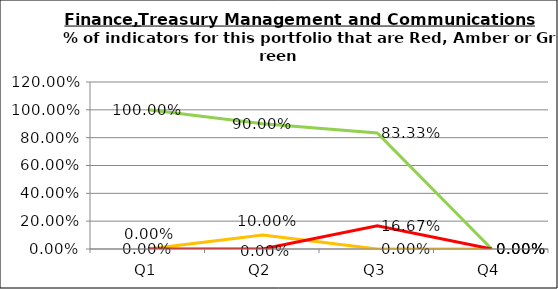
| Category | Green | Amber | Red |
|---|---|---|---|
| Q1 | 1 | 0 | 0 |
| Q2 | 0.9 | 0.1 | 0 |
| Q3 | 0.833 | 0 | 0.167 |
| Q4 | 0 | 0 | 0 |